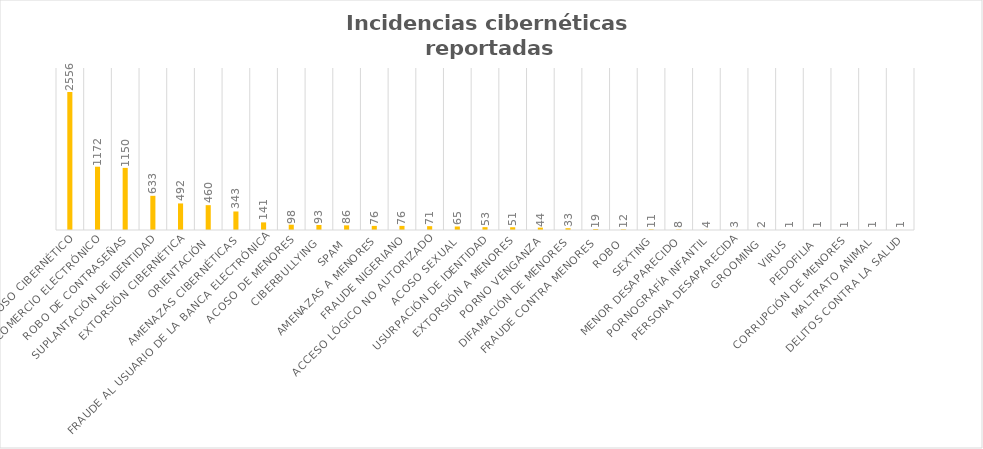
| Category | Número de reportes |
|---|---|
| Acoso cibernético | 2556 |
| Fraude al comercio electrónico | 1172 |
| Robo de contraseñas | 1150 |
| Suplantación de identidad | 633 |
| Extorsión cibernética | 492 |
| Orientación | 460 |
| Amenazas cibernéticas | 343 |
| Fraude al usuario de la banca electrónica | 141 |
| Acoso de menores | 98 |
| Ciberbullying | 93 |
| Spam | 86 |
| Amenazas a menores | 76 |
| Fraude nigeriano | 76 |
| Acceso Lógico no autorizado | 71 |
| Acoso sexual | 65 |
| Usurpación de Identidad | 53 |
| Extorsión a menores | 51 |
| Porno venganza | 44 |
| Difamación de menores | 33 |
| Fraude contra menores  | 19 |
| Robo | 12 |
| Sexting | 11 |
| Menor desaparecido | 8 |
| Pornografía infantil | 4 |
| Persona desaparecida | 3 |
| Grooming | 2 |
| Virus | 1 |
| Pedofilia | 1 |
| Corrupción de menores | 1 |
| Maltrato animal | 1 |
| Delitos contra la salud | 1 |